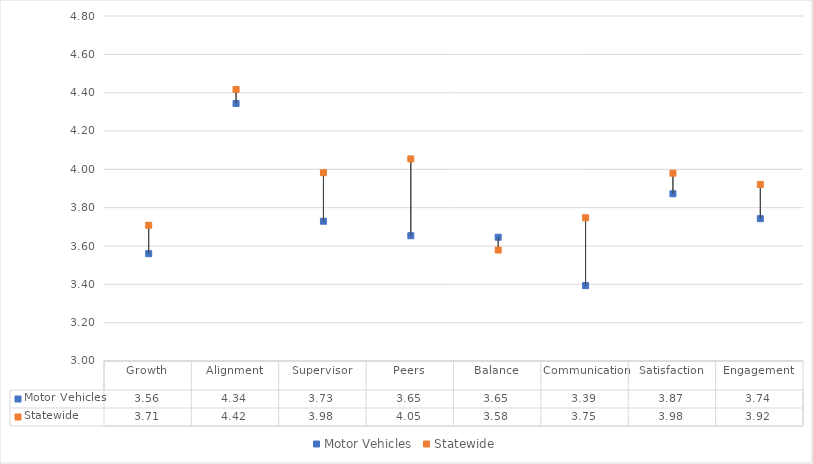
| Category | Motor Vehicles | Statewide |
|---|---|---|
| Growth | 3.56 | 3.708 |
| Alignment | 4.344 | 4.417 |
| Supervisor | 3.729 | 3.983 |
| Peers | 3.654 | 4.054 |
| Balance | 3.646 | 3.579 |
| Communication | 3.393 | 3.747 |
| Satisfaction | 3.872 | 3.98 |
| Engagement | 3.743 | 3.921 |